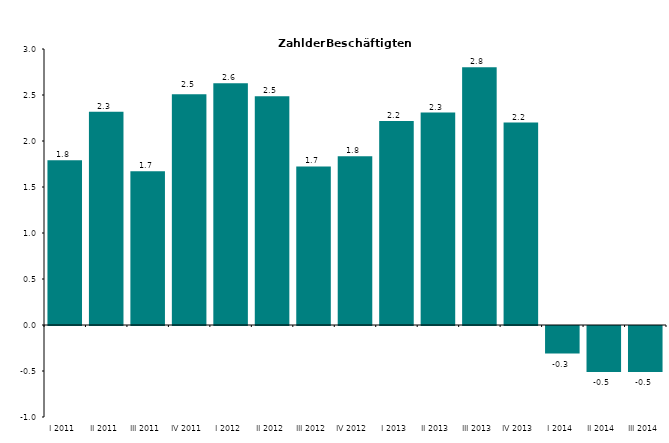
| Category | Series 0 |
|---|---|
| I 2011 | 1.79 |
| II 2011 | 2.319 |
| III 2011 | 1.672 |
| IV 2011 | 2.509 |
| I 2012 | 2.627 |
| II 2012 | 2.487 |
| III 2012 | 1.724 |
| IV 2012 | 1.834 |
| I 2013 | 2.218 |
| II 2013 | 2.309 |
| III 2013 | 2.802 |
| IV 2013 | 2.2 |
| I 2014 | -0.3 |
| II 2014 | -0.5 |
| III 2014 | -0.5 |